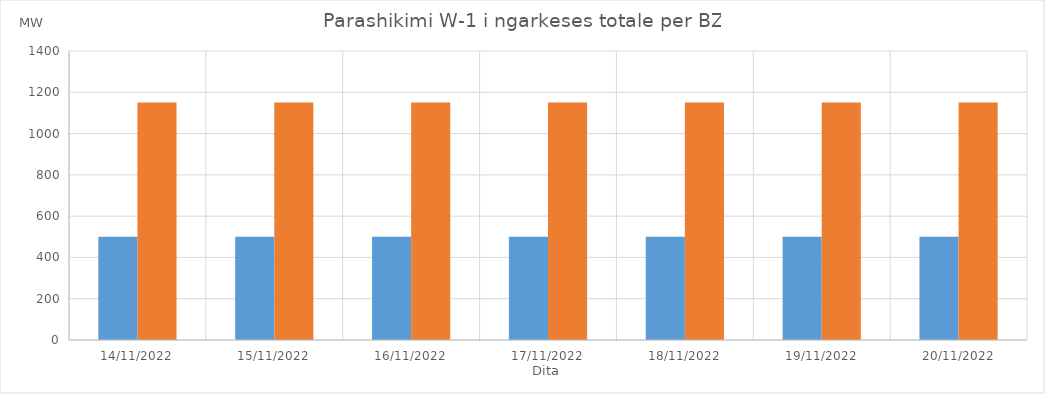
| Category | Min (MW) | Max (MW) |
|---|---|---|
| 14/11/2022 | 500 | 1150 |
| 15/11/2022 | 500 | 1150 |
| 16/11/2022 | 500 | 1150 |
| 17/11/2022 | 500 | 1150 |
| 18/11/2022 | 500 | 1150 |
| 19/11/2022 | 500 | 1150 |
| 20/11/2022 | 500 | 1150 |